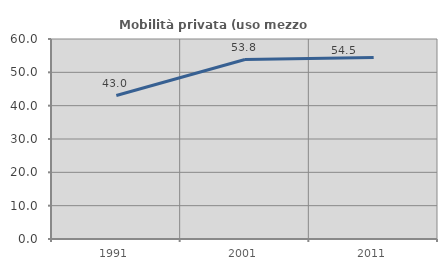
| Category | Mobilità privata (uso mezzo privato) |
|---|---|
| 1991.0 | 43.049 |
| 2001.0 | 53.846 |
| 2011.0 | 54.455 |